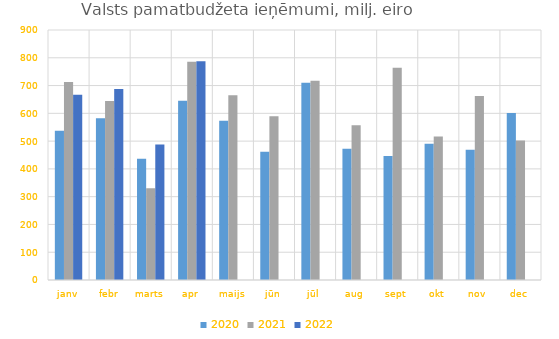
| Category | 2020 | 2021 | 2022 |
|---|---|---|---|
| janv | 537722.948 | 713014.632 | 666661.352 |
| febr | 582097.989 | 644814.957 | 687779.931 |
| marts | 436083.224 | 330339.758 | 487592.334 |
| apr | 645256.276 | 785719.324 | 787062.79 |
| maijs | 572854.69 | 665234.221 | 0 |
| jūn | 461405.873 | 589166.177 | 0 |
| jūl | 709928.085 | 717458.088 | 0 |
| aug | 472605.695 | 557138.062 | 0 |
| sept | 446749.915 | 764496.897 | 0 |
| okt | 490335.515 | 516906.965 | 0 |
| nov | 468560.222 | 662718.632 | 0 |
| dec | 601482.069 | 502474.488 | 0 |